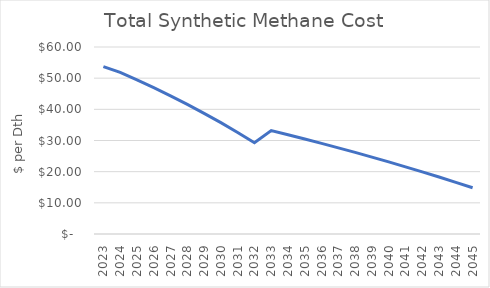
| Category | Total Synthetic Methane Cost |
|---|---|
| 2023.0 | 53.716 |
| 2024.0 | 51.866 |
| 2025.0 | 49.486 |
| 2026.0 | 46.967 |
| 2027.0 | 44.337 |
| 2028.0 | 41.592 |
| 2029.0 | 38.719 |
| 2030.0 | 35.721 |
| 2031.0 | 32.577 |
| 2032.0 | 29.267 |
| 2033.0 | 33.197 |
| 2034.0 | 31.855 |
| 2035.0 | 30.483 |
| 2036.0 | 29.079 |
| 2037.0 | 27.643 |
| 2038.0 | 26.174 |
| 2039.0 | 24.67 |
| 2040.0 | 23.13 |
| 2041.0 | 21.552 |
| 2042.0 | 19.937 |
| 2043.0 | 18.281 |
| 2044.0 | 16.584 |
| 2045.0 | 14.844 |